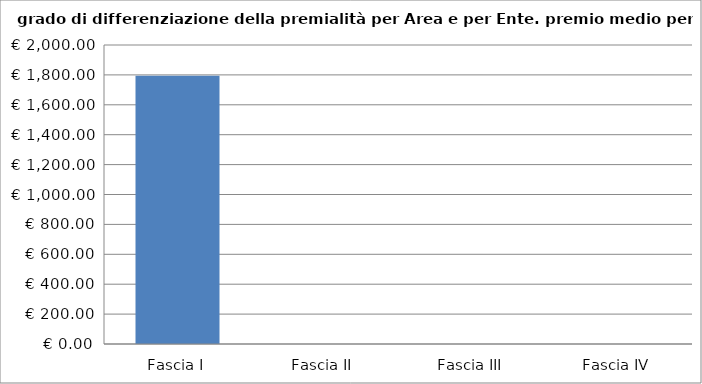
| Category | Totale ente |
|---|---|
| Fascia I | 1793.75 |
| Fascia II | 0 |
| Fascia III | 0 |
| Fascia IV | 0 |